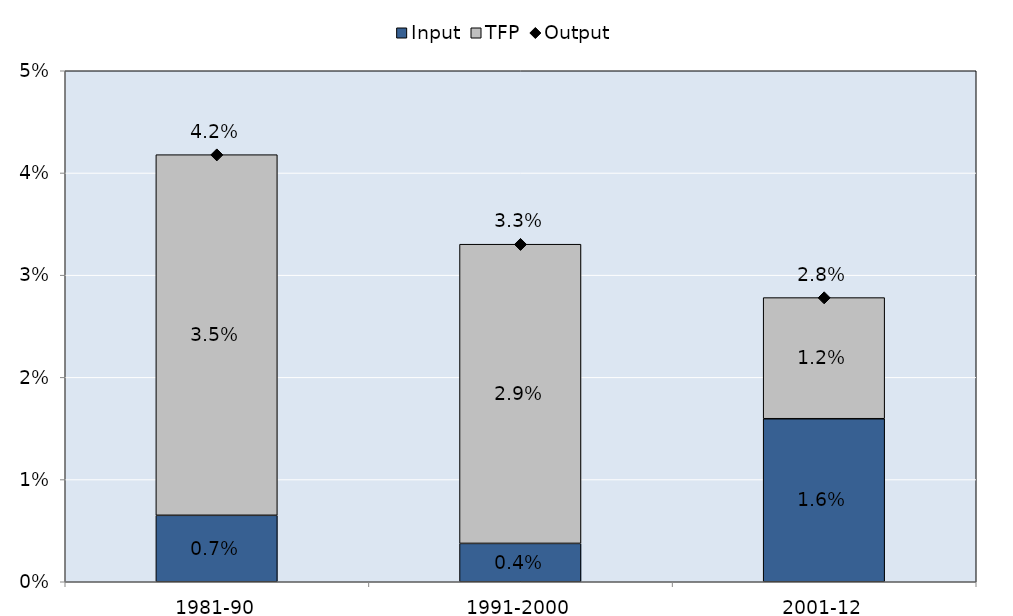
| Category | Input | TFP |
|---|---|---|
| 1981-90 | 0.007 | 0.035 |
| 1991-2000 | 0.004 | 0.029 |
| 2001-12 | 0.016 | 0.012 |